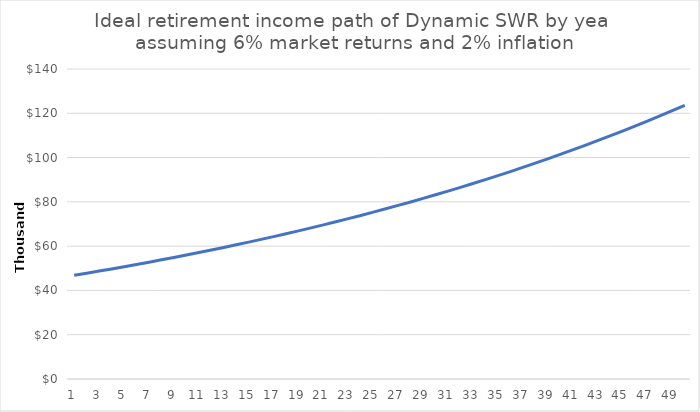
| Category | Series 0 |
|---|---|
| 0 | 46845 |
| 1 | 47782 |
| 2 | 48738 |
| 3 | 49712 |
| 4 | 50707 |
| 5 | 51721 |
| 6 | 52755 |
| 7 | 53810 |
| 8 | 54886 |
| 9 | 55984 |
| 10 | 57104 |
| 11 | 58246 |
| 12 | 59411 |
| 13 | 60599 |
| 14 | 61811 |
| 15 | 63047 |
| 16 | 64308 |
| 17 | 65594 |
| 18 | 66906 |
| 19 | 68244 |
| 20 | 69609 |
| 21 | 71002 |
| 22 | 72422 |
| 23 | 73870 |
| 24 | 75347 |
| 25 | 76854 |
| 26 | 78391 |
| 27 | 79959 |
| 28 | 81558 |
| 29 | 83190 |
| 30 | 84853 |
| 31 | 86550 |
| 32 | 88281 |
| 33 | 90047 |
| 34 | 91848 |
| 35 | 93685 |
| 36 | 95559 |
| 37 | 97470 |
| 38 | 99419 |
| 39 | 101408 |
| 40 | 103436 |
| 41 | 105505 |
| 42 | 107615 |
| 43 | 109767 |
| 44 | 111962 |
| 45 | 114202 |
| 46 | 116486 |
| 47 | 118815 |
| 48 | 121192 |
| 49 | 123615 |